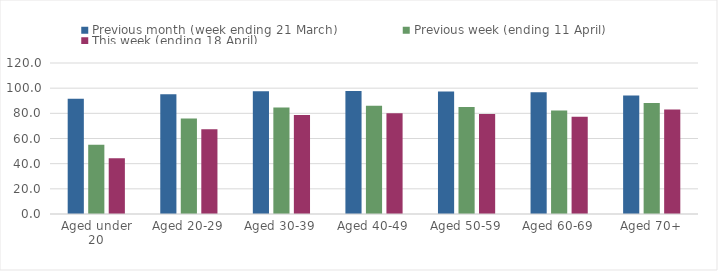
| Category | Previous month (week ending 21 March) | Previous week (ending 11 April) | This week (ending 18 April) |
|---|---|---|---|
| Aged under 20 | 91.683 | 55.095 | 44.373 |
| Aged 20-29 | 95.216 | 75.827 | 67.446 |
| Aged 30-39 | 97.512 | 84.711 | 78.769 |
| Aged 40-49 | 97.845 | 86.078 | 80.044 |
| Aged 50-59 | 97.398 | 84.957 | 79.496 |
| Aged 60-69 | 96.682 | 82.314 | 77.324 |
| Aged 70+ | 94.23 | 88.133 | 82.987 |